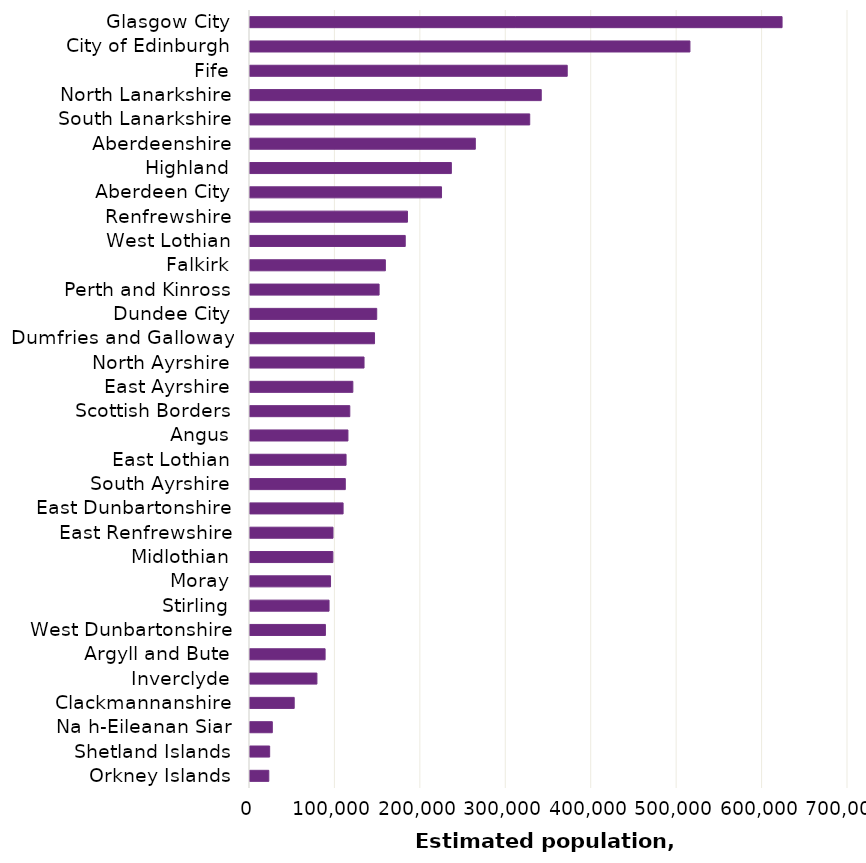
| Category | Estimated population
30 June 2022 |
|---|---|
| Orkney Islands | 22020 |
| Shetland Islands | 23020 |
| Na h-Eileanan Siar | 26120 |
| Clackmannanshire | 51750 |
| Inverclyde | 78340 |
| Argyll and Bute | 87920 |
| West Dunbartonshire | 88270 |
| Stirling | 92530 |
| Moray | 94280 |
| Midlothian | 97030 |
| East Renfrewshire | 97160 |
| East Dunbartonshire | 108980 |
| South Ayrshire | 111560 |
| East Lothian | 112450 |
| Angus | 114660 |
| Scottish Borders | 116820 |
| East Ayrshire | 120390 |
| North Ayrshire | 133490 |
| Dumfries and Galloway | 145770 |
| Dundee City | 148350 |
| Perth and Kinross | 151120 |
| Falkirk | 158450 |
| West Lothian | 181720 |
| Renfrewshire | 184340 |
| Aberdeen City | 224190 |
| Highland | 235710 |
| Aberdeenshire | 263750 |
| South Lanarkshire | 327430 |
| North Lanarkshire | 340930 |
| Fife | 371340 |
| City of Edinburgh | 514990 |
| Glasgow City | 622820 |